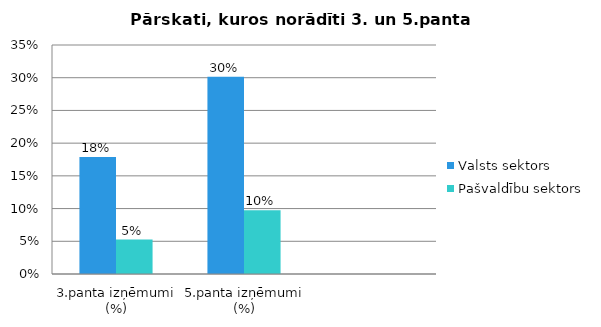
| Category | Valsts sektors | Pašvaldību sektors |
|---|---|---|
| 3.panta izņēmumi (%) | 0.179 | 0.053 |
| 5.panta izņēmumi (%) | 0.301 | 0.097 |